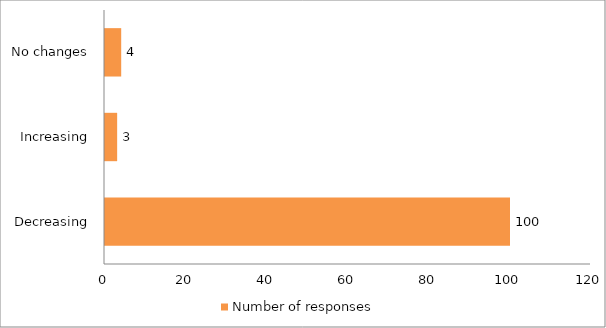
| Category | Number of responses |
|---|---|
| Decreasing | 100 |
| Increasing | 3 |
| No changes | 4 |